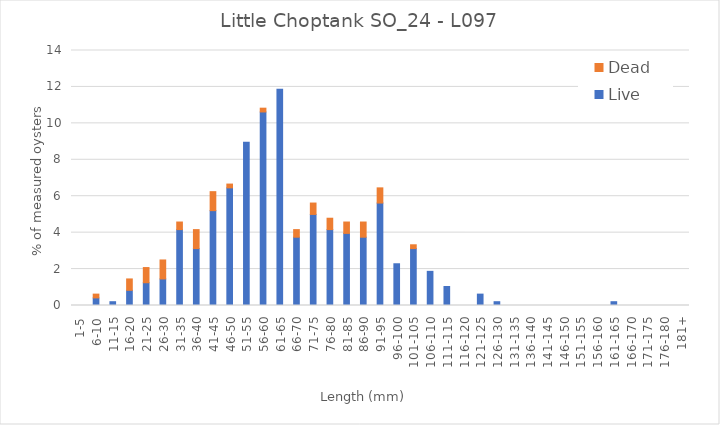
| Category | Live | Dead |
|---|---|---|
| 1-5 | 0 | 0 |
| 6-10 | 0.417 | 0.208 |
| 11-15 | 0.208 | 0 |
| 16-20 | 0.833 | 0.625 |
| 21-25 | 1.25 | 0.833 |
| 26-30 | 1.458 | 1.042 |
| 31-35 | 4.167 | 0.417 |
| 36-40 | 3.125 | 1.042 |
| 41-45 | 5.208 | 1.042 |
| 46-50 | 6.458 | 0.208 |
| 51-55 | 8.958 | 0 |
| 56-60 | 10.625 | 0.208 |
| 61-65 | 11.875 | 0 |
| 66-70 | 3.75 | 0.417 |
| 71-75 | 5 | 0.625 |
| 76-80 | 4.167 | 0.625 |
| 81-85 | 3.958 | 0.625 |
| 86-90 | 3.75 | 0.833 |
| 91-95 | 5.625 | 0.833 |
| 96-100 | 2.292 | 0 |
| 101-105 | 3.125 | 0.208 |
| 106-110 | 1.875 | 0 |
| 111-115 | 1.042 | 0 |
| 116-120 | 0 | 0 |
| 121-125 | 0.625 | 0 |
| 126-130 | 0.208 | 0 |
| 131-135 | 0 | 0 |
| 136-140 | 0 | 0 |
| 141-145 | 0 | 0 |
| 146-150 | 0 | 0 |
| 151-155 | 0 | 0 |
| 156-160 | 0 | 0 |
| 161-165 | 0.208 | 0 |
| 166-170 | 0 | 0 |
| 171-175 | 0 | 0 |
| 176-180 | 0 | 0 |
| 181+ | 0 | 0 |